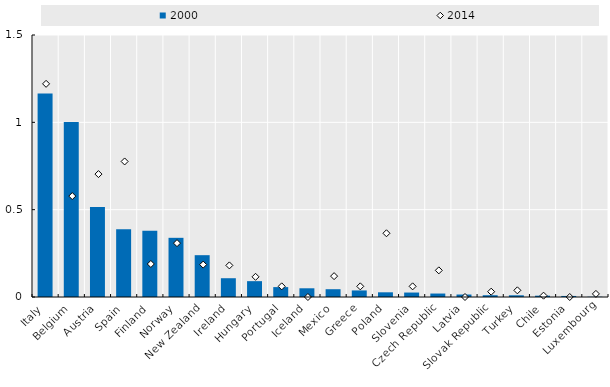
| Category | 2000 |
|---|---|
| Italy | 1.165 |
| Belgium | 1.002 |
| Austria | 0.515 |
| Spain | 0.388 |
| Finland | 0.379 |
| Norway | 0.339 |
| New Zealand | 0.239 |
| Ireland | 0.108 |
| Hungary | 0.091 |
| Portugal | 0.057 |
| Iceland | 0.05 |
| Mexico | 0.045 |
| Greece | 0.038 |
| Poland | 0.027 |
| Slovenia | 0.026 |
| Czech Republic | 0.02 |
| Latvia | 0.014 |
| Slovak Republic | 0.01 |
| Turkey | 0.01 |
| Chile | 0.008 |
| Estonia | 0.006 |
| Luxembourg | 0.002 |